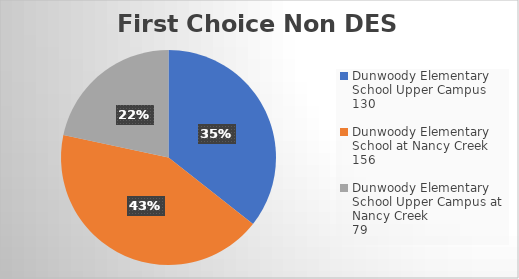
| Category | Series 0 | Series 1 |
|---|---|---|
| Dunwoody Elementary School Upper Campus
130 |  | 130 |
| Dunwoody Elementary School at Nancy Creek
156 |  | 156 |
| Dunwoody Elementary School Upper Campus at Nancy Creek
79 |  | 79 |